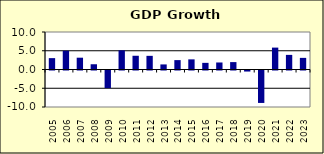
| Category | 1.4 |
|---|---|
| 2005.0 | 3.033 |
| 2006.0 | 5.001 |
| 2007.0 | 3.148 |
| 2008.0 | 1.4 |
| 2009.0 | -4.7 |
| 2010.0 | 5.118 |
| 2011.0 | 3.663 |
| 2012.0 | 3.642 |
| 2013.0 | 1.354 |
| 2014.0 | 2.504 |
| 2015.0 | 2.702 |
| 2016.0 | 1.772 |
| 2017.0 | 1.872 |
| 2018.0 | 1.972 |
| 2019.0 | -0.278 |
| 2020.0 | -8.652 |
| 2021.0 | 5.838 |
| 2022.0 | 3.898 |
| 2023.0 | 3.1 |